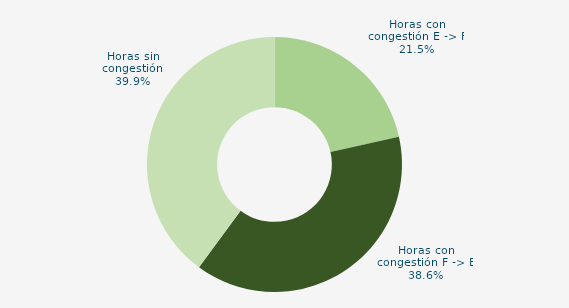
| Category | Horas con congestión E -> F |
|---|---|
| Horas con congestión E -> F | 21.505 |
| Horas con congestión F -> E | 38.575 |
| Horas sin congestión | 39.919 |